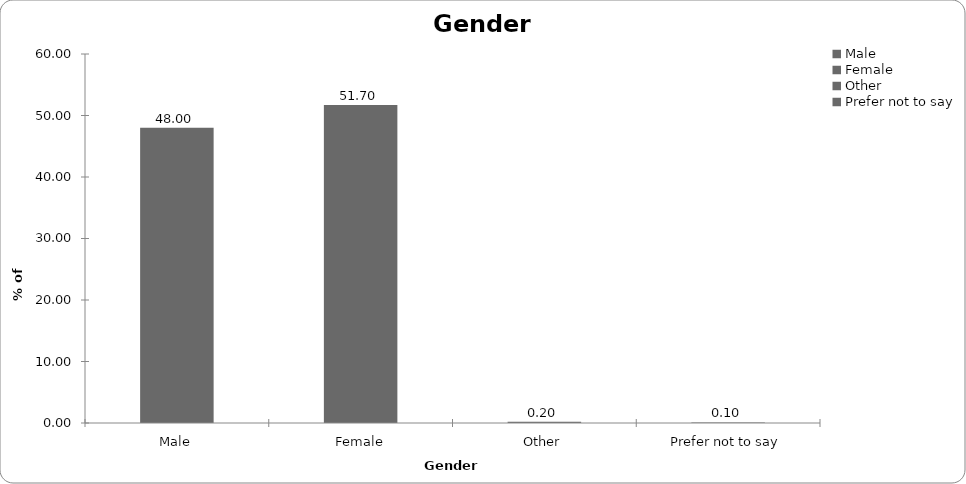
| Category | Series 0 |
|---|---|
| Male | 48.004 |
| Female | 51.697 |
| Other | 0.2 |
| Prefer not to say | 0.1 |